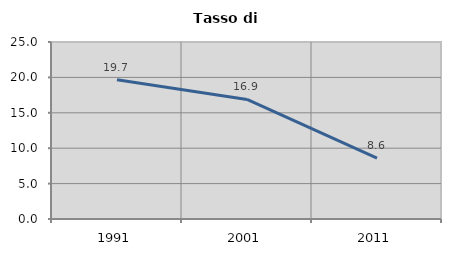
| Category | Tasso di disoccupazione   |
|---|---|
| 1991.0 | 19.669 |
| 2001.0 | 16.886 |
| 2011.0 | 8.588 |